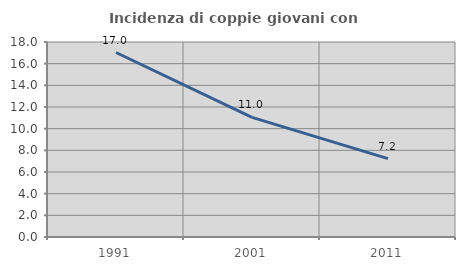
| Category | Incidenza di coppie giovani con figli |
|---|---|
| 1991.0 | 17.029 |
| 2001.0 | 11.047 |
| 2011.0 | 7.239 |